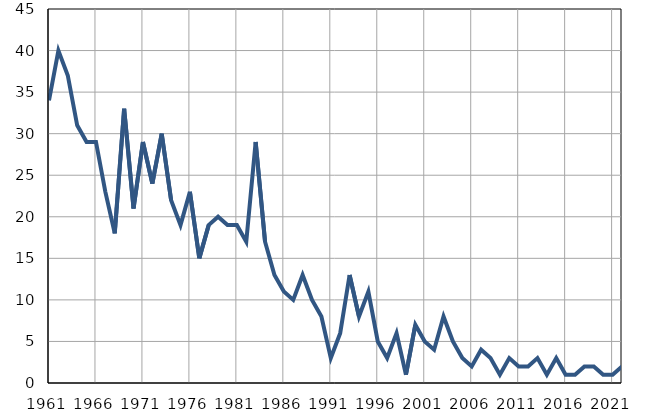
| Category | Умрла 
одојчад |
|---|---|
| 1961.0 | 34 |
| 1962.0 | 40 |
| 1963.0 | 37 |
| 1964.0 | 31 |
| 1965.0 | 29 |
| 1966.0 | 29 |
| 1967.0 | 23 |
| 1968.0 | 18 |
| 1969.0 | 33 |
| 1970.0 | 21 |
| 1971.0 | 29 |
| 1972.0 | 24 |
| 1973.0 | 30 |
| 1974.0 | 22 |
| 1975.0 | 19 |
| 1976.0 | 23 |
| 1977.0 | 15 |
| 1978.0 | 19 |
| 1979.0 | 20 |
| 1980.0 | 19 |
| 1981.0 | 19 |
| 1982.0 | 17 |
| 1983.0 | 29 |
| 1984.0 | 17 |
| 1985.0 | 13 |
| 1986.0 | 11 |
| 1987.0 | 10 |
| 1988.0 | 13 |
| 1989.0 | 10 |
| 1990.0 | 8 |
| 1991.0 | 3 |
| 1992.0 | 6 |
| 1993.0 | 13 |
| 1994.0 | 8 |
| 1995.0 | 11 |
| 1996.0 | 5 |
| 1997.0 | 3 |
| 1998.0 | 6 |
| 1999.0 | 1 |
| 2000.0 | 7 |
| 2001.0 | 5 |
| 2002.0 | 4 |
| 2003.0 | 8 |
| 2004.0 | 5 |
| 2005.0 | 3 |
| 2006.0 | 2 |
| 2007.0 | 4 |
| 2008.0 | 3 |
| 2009.0 | 1 |
| 2010.0 | 3 |
| 2011.0 | 2 |
| 2012.0 | 2 |
| 2013.0 | 3 |
| 2014.0 | 1 |
| 2015.0 | 3 |
| 2016.0 | 1 |
| 2017.0 | 1 |
| 2018.0 | 2 |
| 2019.0 | 2 |
| 2020.0 | 1 |
| 2021.0 | 1 |
| 2022.0 | 2 |